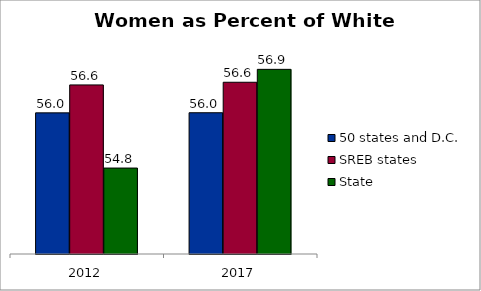
| Category | 50 states and D.C. | SREB states | State |
|---|---|---|---|
| 2012.0 | 55.968 | 56.555 | 54.807 |
| 2017.0 | 55.97 | 56.611 | 56.883 |